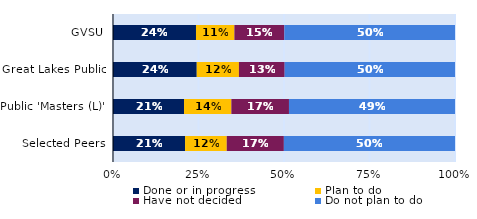
| Category | Done or in progress | Plan to do | Have not decided | Do not plan to do |
|---|---|---|---|---|
| GVSU | 0.243 | 0.112 | 0.146 | 0.499 |
| Great Lakes Public | 0.245 | 0.123 | 0.134 | 0.498 |
| Public 'Masters (L)' | 0.208 | 0.138 | 0.168 | 0.485 |
| Selected Peers | 0.211 | 0.122 | 0.167 | 0.5 |